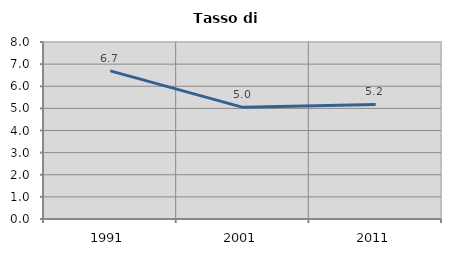
| Category | Tasso di disoccupazione   |
|---|---|
| 1991.0 | 6.695 |
| 2001.0 | 5.045 |
| 2011.0 | 5.178 |